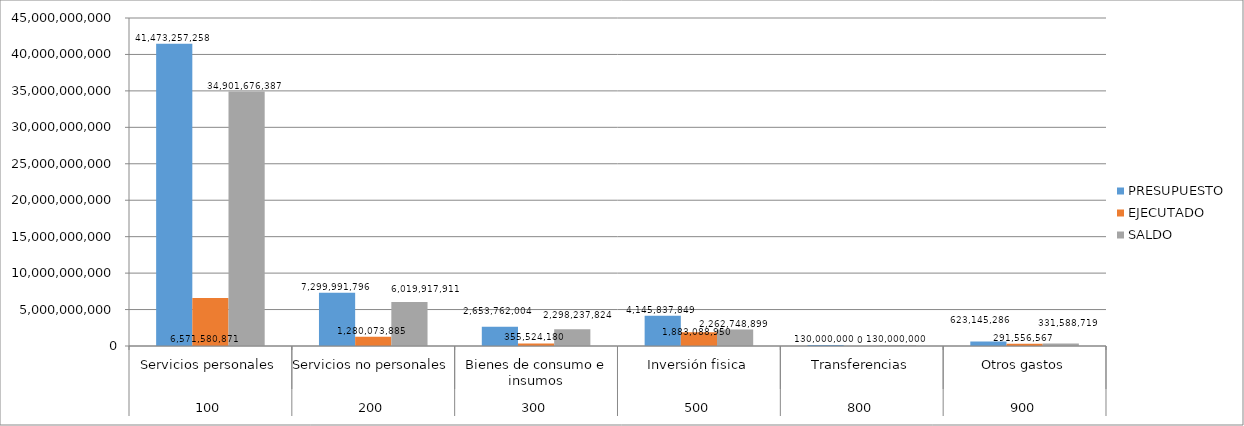
| Category | PRESUPUESTO | EJECUTADO | SALDO |
|---|---|---|---|
| 0 | 41473257258 | 6571580871 | 34901676387 |
| 1 | 7299991796 | 1280073885 | 6019917911 |
| 2 | 2653762004 | 355524180 | 2298237824 |
| 3 | 4145837849 | 1883088950 | 2262748899 |
| 4 | 130000000 | 0 | 130000000 |
| 5 | 623145286 | 291556567 | 331588719 |